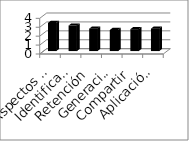
| Category | Series 0 |
|---|---|
| Aspectos generales | 3.156 |
| Identificación | 2.864 |
| Retención | 2.512 |
| Generación  | 2.364 |
| Compartir  | 2.452 |
| Aplicación  | 2.514 |